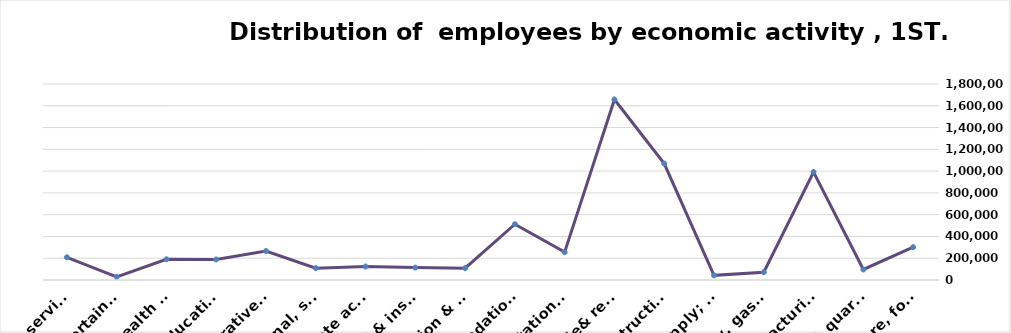
| Category | Series 0 |
|---|---|
| Agriculture, forestry & fishing | 301856 |
| Mining & quarrying | 96657 |
| Manufacturing | 991332 |
| Electricity, gas, steam & air conditioning supply | 71390 |
| Water supply; sewerage, waste remediation  | 42816 |
| Construction | 1068915 |
| Wholesale& retail trade; repair of motor vehicles | 1657485 |
| Transportation& storage | 255642 |
| Accommodation & food service activities | 512256 |
| Information & communication | 108993 |
| Financial & insurance | 113697 |
| Real estate activities | 123794 |
| Professional, scientific & technical activities | 108948 |
| Administrative and support service activities | 265997 |
| Education | 188719 |
| Human health and &l work activities | 189993 |
| Arts, entertainment & recreation | 29178 |
| Other service | 208363 |